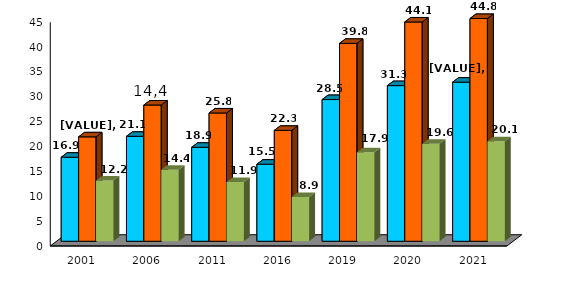
| Category | Series 0 | Series 1 | Series 2 |
|---|---|---|---|
| 2001.0 | 16.9 | 21 | 12.2 |
| 2006.0 | 21.1 | 27.4 | 14.4 |
| 2011.0 | 18.9 | 25.8 | 11.9 |
| 2016.0 | 15.5 | 22.3 | 8.9 |
| 2019.0 | 28.5 | 39.8 | 17.9 |
| 2020.0 | 31.3 | 44.1 | 19.6 |
| 2021.0 | 32 | 44.8 | 20.1 |